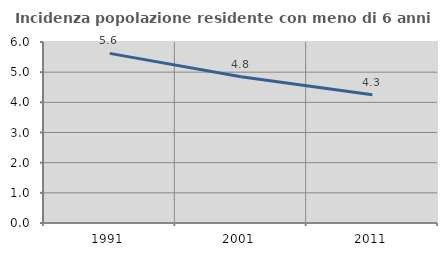
| Category | Incidenza popolazione residente con meno di 6 anni |
|---|---|
| 1991.0 | 5.622 |
| 2001.0 | 4.847 |
| 2011.0 | 4.252 |